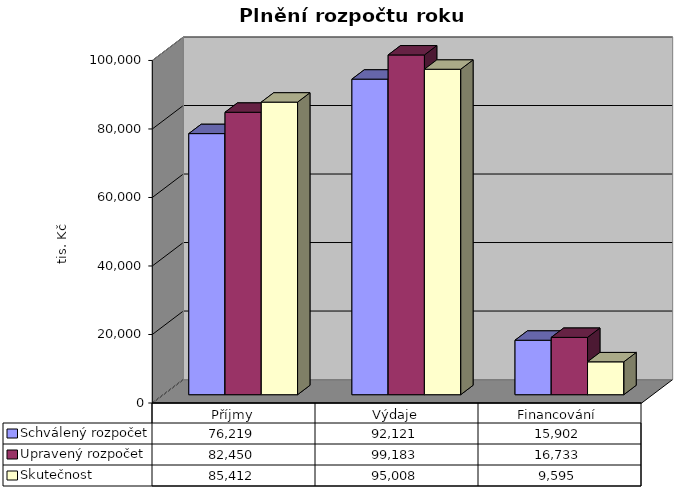
| Category | Schválený rozpočet | Upravený rozpočet | Skutečnost |
|---|---|---|---|
| Příjmy | 76219 | 82450 | 85412 |
| Výdaje | 92121 | 99183 | 95008 |
| Financování | 15902 | 16733 | 9595 |